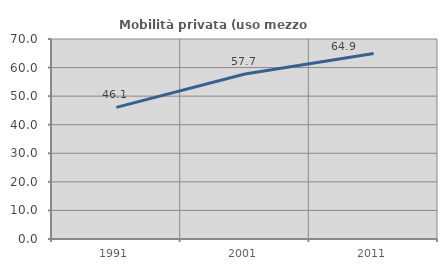
| Category | Mobilità privata (uso mezzo privato) |
|---|---|
| 1991.0 | 46.084 |
| 2001.0 | 57.737 |
| 2011.0 | 64.922 |